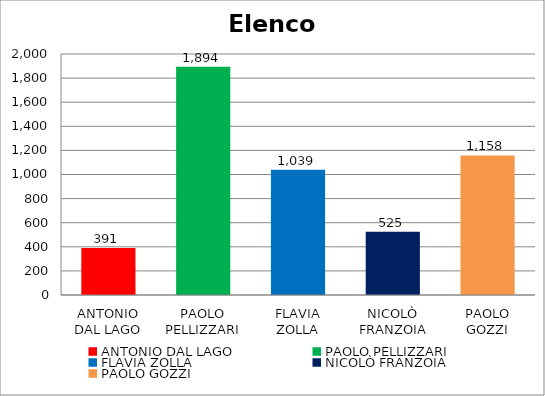
| Category | Elenco liste |
|---|---|
| ANTONIO DAL LAGO | 391 |
| PAOLO PELLIZZARI | 1894 |
| FLAVIA ZOLLA | 1039 |
| NICOLÒ FRANZOIA | 525 |
| PAOLO GOZZI | 1158 |